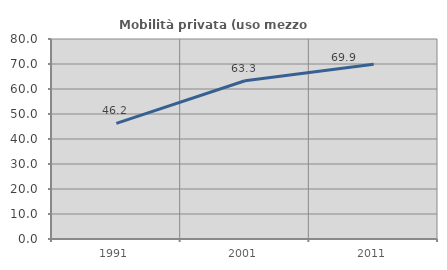
| Category | Mobilità privata (uso mezzo privato) |
|---|---|
| 1991.0 | 46.224 |
| 2001.0 | 63.297 |
| 2011.0 | 69.902 |